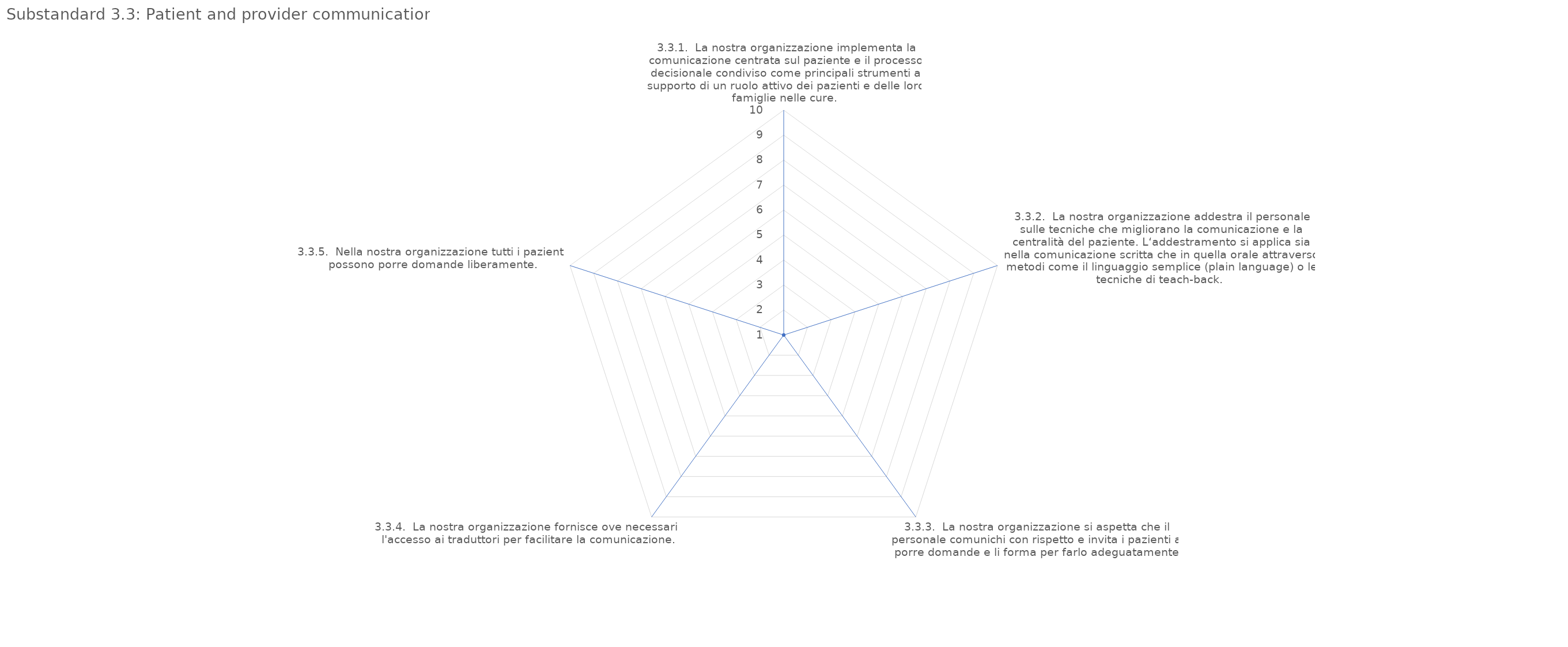
| Category | value |
|---|---|
| 3.3.1.  La nostra organizzazione implementa la comunicazione centrata sul paziente e il processo decisionale condiviso come principali strumenti a supporto di un ruolo attivo dei pazienti e delle loro famiglie nelle cure. | 1 |
| 3.3.2.  La nostra organizzazione addestra il personale sulle tecniche che migliorano la comunicazione e la centralità del paziente. L‘addestramento si applica sia nella comunicazione scritta che in quella orale attraverso metodi come il linguaggio semplic | 1 |
| 3.3.3.  La nostra organizzazione si aspetta che il personale comunichi con rispetto e invita i pazienti a porre domande e li forma per farlo adeguatamente. | 1 |
| 3.3.4.  La nostra organizzazione fornisce ove necessario l'accesso ai traduttori per facilitare la comunicazione. | 1 |
| 3.3.5.  Nella nostra organizzazione tutti i pazienti possono porre domande liberamente. | 1 |